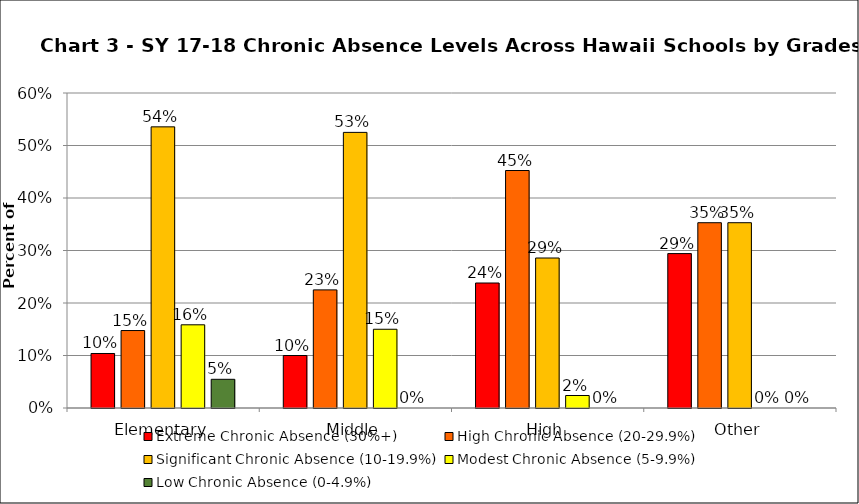
| Category | Extreme Chronic Absence (30%+) | High Chronic Absence (20-29.9%) | Significant Chronic Absence (10-19.9%) | Modest Chronic Absence (5-9.9%) | Low Chronic Absence (0-4.9%) |
|---|---|---|---|---|---|
| 0 | 0.104 | 0.148 | 0.536 | 0.158 | 0.055 |
| 1 | 0.1 | 0.225 | 0.525 | 0.15 | 0 |
| 2 | 0.238 | 0.452 | 0.286 | 0.024 | 0 |
| 3 | 0.294 | 0.353 | 0.353 | 0 | 0 |